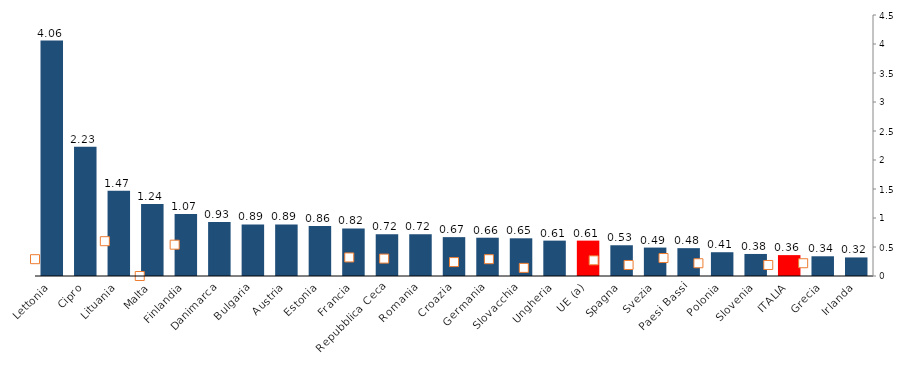
| Category | Series 0 |
|---|---|
| Lettonia | 4.06 |
| Cipro | 2.23 |
| Lituania | 1.47 |
| Malta | 1.24 |
| Finlandia | 1.07 |
| Danimarca | 0.93 |
| Bulgaria | 0.89 |
| Austria | 0.89 |
| Estonia | 0.86 |
| Francia | 0.82 |
| Repubblica Ceca | 0.72 |
| Romania | 0.72 |
| Croazia | 0.67 |
| Germania | 0.66 |
| Slovacchia | 0.65 |
| Ungheria | 0.61 |
| UE (a) | 0.61 |
| Spagna | 0.53 |
| Svezia | 0.49 |
| Paesi Bassi | 0.48 |
| Polonia | 0.41 |
| Slovenia | 0.38 |
| ITALIA | 0.36 |
| Grecia | 0.34 |
| Irlanda | 0.32 |